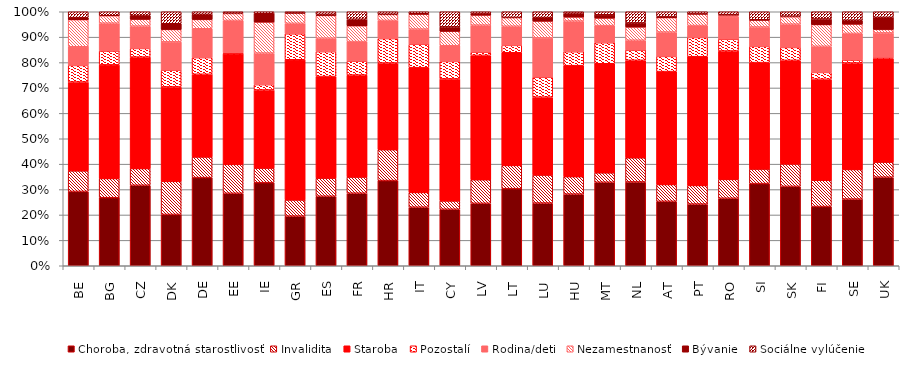
| Category | Choroba, zdravotná starostlivosť | Invalidita | Staroba | Pozostalí | Rodina/deti | Nezamestnanosť | Bývanie | Sociálne vylúčenie |
|---|---|---|---|---|---|---|---|---|
| BE | 28.02 | 7.76 | 33.51 | 6.27 | 7.02 | 10.21 | 0.77 | 2.23 |
| BG | 26.02 | 7.35 | 43.44 | 5.32 | 10.63 | 2.82 | 0 | 1.54 |
| CZ | 30.78 | 6.41 | 42.62 | 3.33 | 8.52 | 2.61 | 1.42 | 1.46 |
| DK | 19.45 | 12.56 | 35.82 | 6.33 | 10.76 | 4.7 | 2.18 | 4.54 |
| DE | 33.22 | 7.8 | 31.14 | 6.3 | 10.86 | 3.51 | 1.9 | 1 |
| EE | 28.18 | 11.27 | 43 | 0.37 | 12.61 | 2.68 | 0.16 | 0.55 |
| IE | 30.54 | 5.37 | 28.71 | 1.97 | 11.59 | 11.41 | 3.05 | 0.73 |
| GR | 19.3 | 6.28 | 54.45 | 10.12 | 4.05 | 3.91 | 0.11 | 0.48 |
| ES | 26.85 | 7.03 | 39.23 | 9.65 | 5.19 | 8.79 | 0.41 | 1.01 |
| FR | 26.88 | 6.01 | 37.78 | 5.14 | 7.27 | 5.85 | 2.43 | 2.78 |
| HR | 32.94 | 11.96 | 33.52 | 9.46 | 6.98 | 2.32 | 0.11 | 0.95 |
| IT | 22.23 | 5.62 | 47.36 | 8.91 | 5.75 | 5.7 | 0.12 | 0.76 |
| CY | 21.75 | 3.23 | 46.96 | 6.75 | 6.04 | 5.57 | 1.67 | 5.84 |
| LV | 24.21 | 9.17 | 48.23 | 1.24 | 10.5 | 3.89 | 0.58 | 0.72 |
| LT | 28.86 | 8.72 | 42.17 | 2.79 | 7.15 | 3.26 | 0.05 | 2.11 |
| LU | 24.3 | 10.88 | 30.19 | 7.73 | 15.25 | 6.49 | 1.4 | 2.23 |
| HU | 27.83 | 6.79 | 43.1 | 5.45 | 11.88 | 1.58 | 1.45 | 0.59 |
| MT | 32.52 | 3.69 | 42.48 | 8.23 | 6.64 | 2.94 | 1.27 | 1.19 |
| NL | 31.07 | 8.95 | 36.13 | 3.81 | 3.64 | 4.91 | 1.51 | 4.14 |
| AT | 24.7 | 6.47 | 43.29 | 5.85 | 9.33 | 5.5 | 0.4 | 1.88 |
| PT | 23.35 | 7.06 | 48.75 | 7.29 | 4.51 | 4.4 | 0.01 | 0.81 |
| RO | 25.97 | 7.28 | 49.41 | 4.56 | 8.61 | 0.72 | 0.11 | 1.11 |
| SI | 31.79 | 5.64 | 41.18 | 6.29 | 7.5 | 2.69 | 0.1 | 3.11 |
| SK | 30.42 | 8.61 | 39.71 | 4.99 | 8.9 | 2.83 | 0.23 | 1.7 |
| FI | 22.9 | 10.18 | 39.07 | 2.65 | 10.09 | 8.39 | 2.19 | 2.79 |
| SE | 25.72 | 11.44 | 41.09 | 1.15 | 10.25 | 3.6 | 1.52 | 3.25 |
| UK | 34.59 | 5.91 | 40.6 | 0.3 | 9.57 | 1.36 | 4.71 | 2.2 |